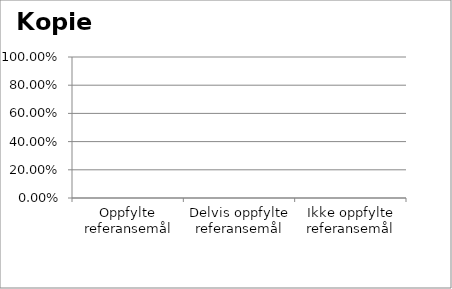
| Category | Kopier |
|---|---|
| Oppfylte referansemål | 0 |
| Delvis oppfylte referansemål | 0 |
| Ikke oppfylte referansemål | 0 |